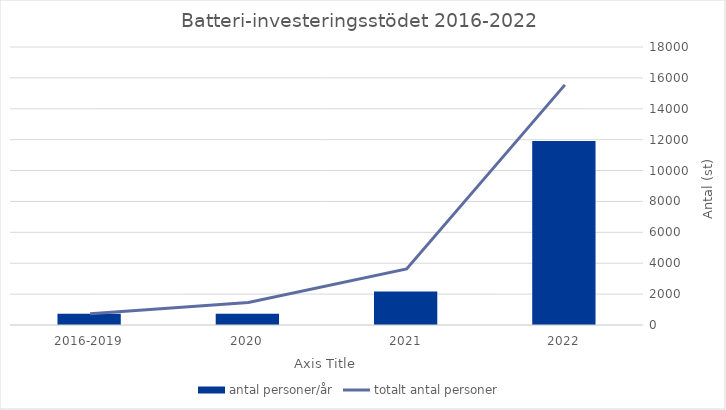
| Category | antal personer/år |
|---|---|
| 2016-2019 | 731 |
| 2020 | 729 |
| 2021 | 2171 |
| 2022 | 11916 |